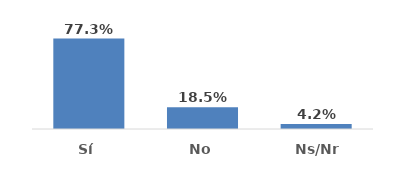
| Category | Series 0 |
|---|---|
| Sí | 0.773 |
| No | 0.185 |
| Ns/Nr | 0.042 |